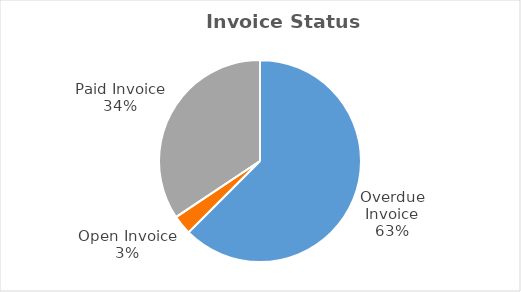
| Category | Total |
|---|---|
| Overdue Invoice | 20 |
| Open Invoice | 1 |
| Paid Invoice | 11 |